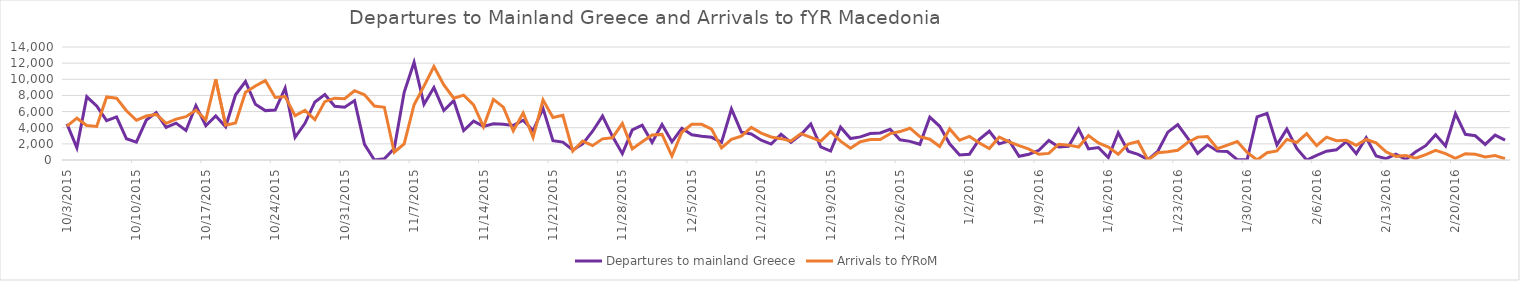
| Category | Departures to mainland Greece | Arrivals to fYRoM |
|---|---|---|
| 10/3/15 | 4480 | 4202 |
| 10/4/15 | 1513 | 5181 |
| 10/5/15 | 7833 | 4282 |
| 10/6/15 | 6707 | 4156 |
| 10/7/15 | 4886 | 7816 |
| 10/8/15 | 5349 | 7663 |
| 10/9/15 | 2631 | 6107 |
| 10/10/15 | 2214 | 4922 |
| 10/11/15 | 4950 | 5448 |
| 10/12/15 | 5879 | 5645 |
| 10/13/15 | 4052 | 4551 |
| 10/14/15 | 4564 | 5073 |
| 10/15/15 | 3660 | 5373 |
| 10/16/15 | 6743 | 6181 |
| 10/17/15 | 4239 | 4988 |
| 10/18/15 | 5457 | 10005 |
| 10/19/15 | 4119 | 4299 |
| 10/20/15 | 8083 | 4584 |
| 10/21/15 | 9725 | 8384 |
| 10/22/15 | 6896 | 9174 |
| 10/23/15 | 6120 | 9840 |
| 10/24/15 | 6195 | 7752 |
| 10/25/15 | 8916 | 7864 |
| 10/26/15 | 2804 | 5500 |
| 10/27/15 | 4540 | 6146 |
| 10/28/15 | 7191 | 5000 |
| 10/29/15 | 8117 | 7231 |
| 10/30/15 | 6649 | 7663 |
| 10/31/15 | 6537 | 7590 |
| 11/1/15 | 7360 | 8584 |
| 11/2/15 | 1935 | 8075 |
| 11/3/15 | 0 | 6682 |
| 11/4/15 | 142 | 6532 |
| 11/5/15 | 1430 | 960 |
| 11/6/15 | 8392 | 1987 |
| 11/7/15 | 12116 | 6847 |
| 11/8/15 | 6902 | 9148 |
| 11/9/15 | 8977 | 11572 |
| 11/10/15 | 6133 | 9305 |
| 11/11/15 | 7354 | 7651 |
| 11/12/15 | 3650 | 8038 |
| 11/13/15 | 4820 | 6826 |
| 11/14/15 | 4171 | 4107 |
| 11/15/15 | 4497 | 7511 |
| 11/16/15 | 4442 | 6557 |
| 11/17/15 | 4289 | 3621 |
| 11/18/15 | 4927 | 5831 |
| 11/19/15 | 3644 | 2816 |
| 11/20/15 | 6389 | 7453 |
| 11/21/15 | 2401 | 5255 |
| 11/22/15 | 2214 | 5539 |
| 11/23/15 | 1245 | 1113 |
| 11/24/15 | 2006 | 2347 |
| 11/25/15 | 3565 | 1779 |
| 11/26/15 | 5435 | 2617 |
| 11/27/15 | 2932 | 2744 |
| 11/28/15 | 778 | 4520 |
| 11/29/15 | 3736 | 1373 |
| 11/30/15 | 4318 | 2270 |
| 12/1/15 | 2181 | 3094 |
| 12/2/15 | 4384 | 3174 |
| 12/3/15 | 2255 | 494 |
| 12/4/15 | 3934 | 3436 |
| 12/5/15 | 3115 | 4430 |
| 12/6/15 | 2943 | 4425 |
| 12/7/15 | 2810 | 3826 |
| 12/8/15 | 2189 | 1508 |
| 12/9/15 | 6316 | 2550 |
| 12/10/15 | 3456 | 2956 |
| 12/11/15 | 3219 | 4047 |
| 12/12/15 | 2453 | 3338 |
| 12/13/15 | 1976 | 2849 |
| 12/14/15 | 3175 | 2644 |
| 12/15/15 | 2191 | 2349 |
| 12/16/15 | 3137 | 3264 |
| 12/17/15 | 4461 | 2801 |
| 12/18/15 | 1638 | 2332 |
| 12/19/15 | 1110 | 3515 |
| 12/20/15 | 4070 | 2338 |
| 12/21/15 | 2652 | 1470 |
| 12/22/15 | 2864 | 2272 |
| 12/23/15 | 3278 | 2529 |
| 12/24/15 | 3349 | 2529 |
| 12/25/15 | 3806 | 3268 |
| 12/26/15 | 2498 | 3521 |
| 12/27/15 | 2311 | 3938 |
| 12/28/15 | 1946 | 2884 |
| 12/29/15 | 5309 | 2577 |
| 12/30/15 | 4178 | 1665 |
| 12/31/15 | 2009 | 3848 |
| 1/1/16 | 623 | 2454 |
| 1/2/16 | 720 | 2918 |
| 1/3/16 | 2569 | 2112 |
| 1/4/16 | 3563 | 1415 |
| 1/5/16 | 1998 | 2842 |
| 1/6/16 | 2377 | 2258 |
| 1/7/16 | 463 | 1776 |
| 1/8/16 | 716 | 1344 |
| 1/9/16 | 1203 | 715 |
| 1/10/16 | 2417 | 819 |
| 1/11/16 | 1621 | 1959 |
| 1/12/16 | 1701 | 1840 |
| 1/13/16 | 3861 | 1600 |
| 1/14/16 | 1378 | 3022 |
| 1/15/16 | 1551 | 2119 |
| 1/16/16 | 301 | 1598 |
| 1/17/16 | 3378 | 720 |
| 1/18/16 | 1078 | 1980 |
| 1/19/16 | 695 | 2298 |
| 1/20/16 | 50 | 0 |
| 1/21/16 | 1108 | 892 |
| 1/22/16 | 3451 | 1030 |
| 1/23/16 | 4397 | 1208 |
| 1/24/16 | 2706 | 2174 |
| 1/25/16 | 819 | 2836 |
| 1/26/16 | 1887 | 2908 |
| 1/27/16 | 1098 | 1402 |
| 1/28/16 | 1046 | 1837 |
| 1/29/16 | 40 | 2292 |
| 1/30/16 | 53 | 931 |
| 1/31/16 | 5342 | 0 |
| 2/1/16 | 5783 | 908 |
| 2/2/16 | 1878 | 1121 |
| 2/3/16 | 3829 | 2558 |
| 2/4/16 | 1436 | 2173 |
| 2/5/16 | 0 | 3259 |
| 2/6/16 | 578 | 1780 |
| 2/7/16 | 1097 | 2838 |
| 2/8/16 | 1259 | 2392 |
| 2/9/16 | 2283 | 2441 |
| 2/10/16 | 793 | 1817 |
| 2/11/16 | 2756 | 2540 |
| 2/12/16 | 496 | 2115 |
| 2/13/16 | 161 | 1019 |
| 2/14/16 | 724 | 452 |
| 2/15/16 | 65 | 542 |
| 2/16/16 | 1024 | 234 |
| 2/17/16 | 1772 | 668 |
| 2/18/16 | 3118 | 1200 |
| 2/19/16 | 1731 | 799 |
| 2/20/16 | 5738 | 209 |
| 2/21/16 | 3180 | 774 |
| 2/22/16 | 3002 | 714 |
| 2/23/16 | 1927 | 382 |
| 2/24/16 | 3086 | 551 |
| 2/25/16 | 2468 | 168 |